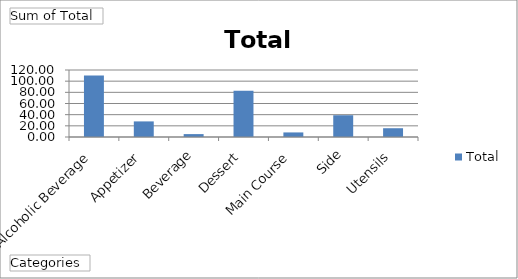
| Category | Total |
|---|---|
| Alcoholic Beverage | 110.176 |
| Appetizer | 27.94 |
| Beverage | 5.198 |
| Dessert | 82.824 |
| Main Course | 8.19 |
| Side | 38.96 |
| Utensils | 15.719 |